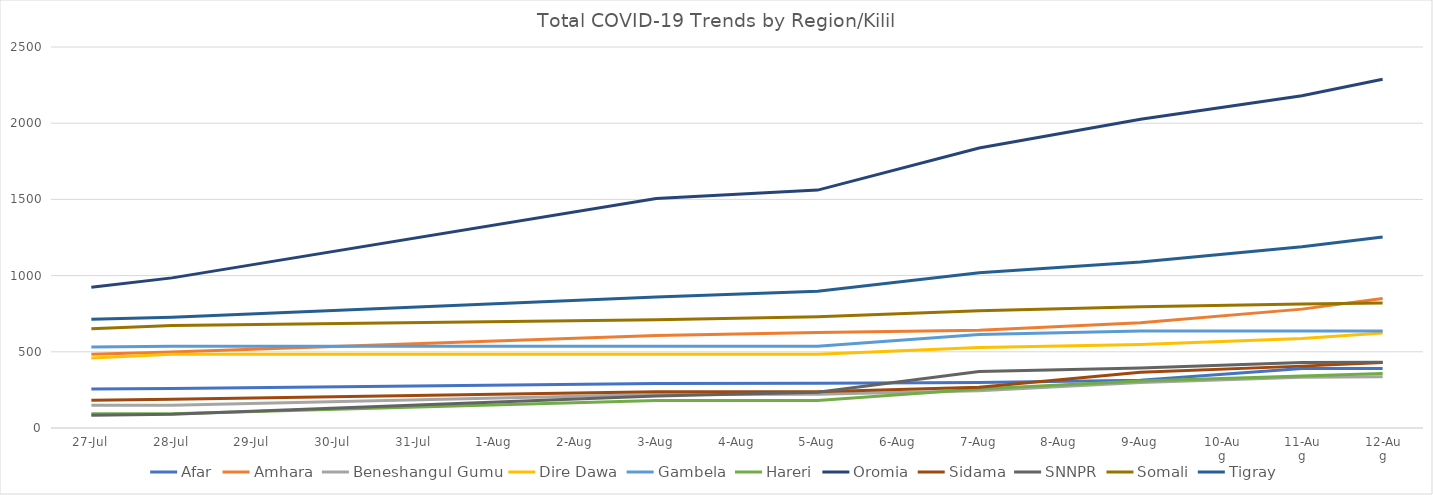
| Category | Afar | Amhara | Beneshangul Gumu | Dire Dawa | Gambela | Hareri | Oromia | Sidama | SNNPR | Somali | Tigray |
|---|---|---|---|---|---|---|---|---|---|---|---|
| 2020-07-27 | 256 | 484 | 149 | 459 | 531 | 94 | 923 | 182 | 83 | 651 | 713 |
| 2020-07-28 | 260 | 499 | 149 | 484 | 536 | 94 | 985 | 188 | 90 | 673 | 727 |
| 2020-08-03 | 292 | 607 | 219 | 484 | 536 | 181 | 1506 | 238 | 210 | 711 | 860 |
| 2020-08-05 | 293 | 627 | 221 | 484 | 536 | 181 | 1561 | 238 | 234 | 730 | 897 |
| 2020-08-07 | 299 | 641 | 245 | 528 | 614 | 256 | 1837 | 267 | 370 | 769 | 1019 |
| 2020-08-09 | 313 | 691 | 299 | 548 | 637 | 309 | 2026 | 366 | 393 | 795 | 1089 |
| 2020-08-11 | 391 | 780 | 333 | 588 | 637 | 342 | 2180 | 406 | 429 | 814 | 1189 |
| 2020-08-12 | 391 | 850 | 336 | 624 | 637 | 357 | 2288 | 430 | 432 | 821 | 1254 |